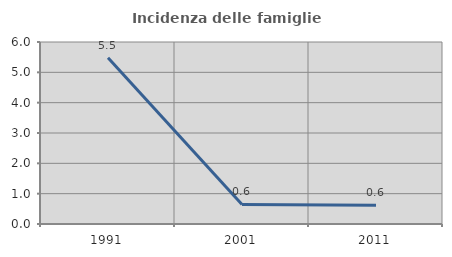
| Category | Incidenza delle famiglie numerose |
|---|---|
| 1991.0 | 5.479 |
| 2001.0 | 0.645 |
| 2011.0 | 0.621 |